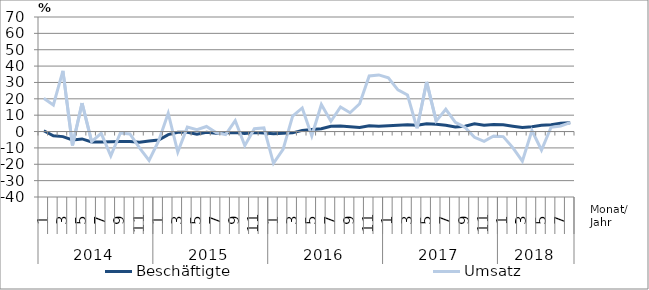
| Category | Beschäftigte | Umsatz |
|---|---|---|
| 0 | 0.5 | 20.3 |
| 1 | -2.6 | 16.2 |
| 2 | -3.1 | 37.1 |
| 3 | -5.1 | -8.5 |
| 4 | -4.5 | 17.4 |
| 5 | -6.4 | -6.1 |
| 6 | -6.4 | -1.1 |
| 7 | -6.2 | -14.9 |
| 8 | -6.1 | -0.9 |
| 9 | -6.1 | -1.5 |
| 10 | -6.6 | -10 |
| 11 | -5.8 | -17.6 |
| 12 | -5.2 | -5.7 |
| 13 | -1.9 | 11.2 |
| 14 | -0.5 | -12.5 |
| 15 | -0.5 | 2.7 |
| 16 | -1.7 | 1.2 |
| 17 | -0.5 | 3.1 |
| 18 | -1.1 | -0.6 |
| 19 | -0.8 | -1.8 |
| 20 | -0.6 | 6.7 |
| 21 | -1.2 | -8.6 |
| 22 | -0.6 | 1.7 |
| 23 | -0.9 | 2.2 |
| 24 | -1.3 | -19.4 |
| 25 | -1.1 | -10.9 |
| 26 | -0.8 | 9.4 |
| 27 | 0.7 | 14.4 |
| 28 | 1.2 | -2.6 |
| 29 | 1.7 | 16.5 |
| 30 | 3.2 | 6.3 |
| 31 | 3.4 | 15 |
| 32 | 3 | 11.5 |
| 33 | 2.5 | 17 |
| 34 | 3.6 | 34 |
| 35 | 3.2 | 34.6 |
| 36 | 3.5 | 32.8 |
| 37 | 3.8 | 25.5 |
| 38 | 4.2 | 22.3 |
| 39 | 3.9 | 2 |
| 40 | 4.7 | 30.3 |
| 41 | 4.4 | 6.4 |
| 42 | 3.9 | 13.6 |
| 43 | 2.8 | 5.6 |
| 44 | 3.3 | 2.6 |
| 45 | 4.7 | -3.5 |
| 46 | 3.8 | -6 |
| 47 | 4.3 | -2.7 |
| 48 | 4.2 | -3.1 |
| 49 | 3.3 | -9.8 |
| 50 | 2.5 | -18.1 |
| 51 | 3 | 0.6 |
| 52 | 3.8 | -11.3 |
| 53 | 4.2 | 2.6 |
| 54 | 5 | 3.4 |
| 55 | 5.4 | 5.5 |